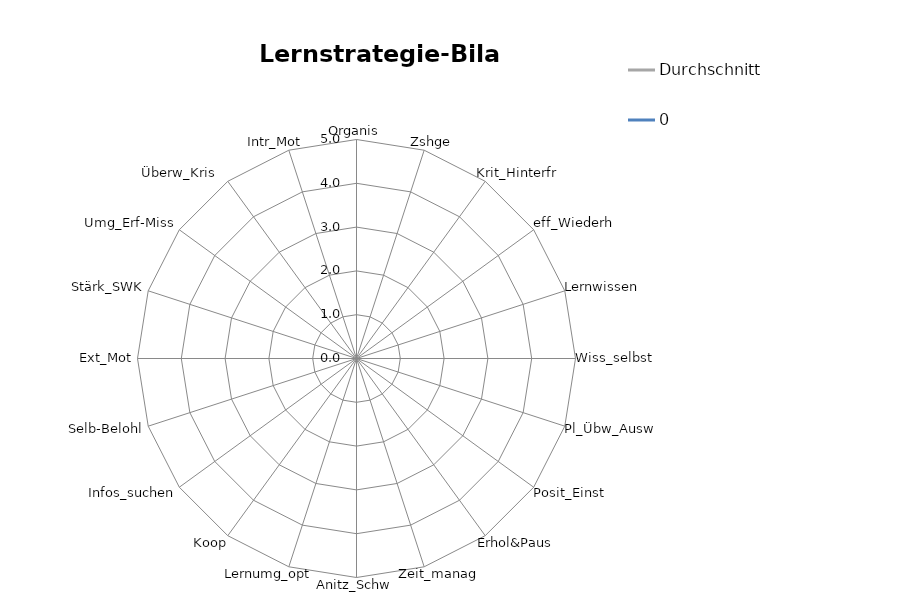
| Category | Durchschnitt | 0 |
|---|---|---|
| Organis | 0 | 0 |
| Zshge | 0 | 0 |
| Krit_Hinterfr | 0 | 0 |
| eff_Wiederh | 0 | 0 |
| Lernwissen | 0 | 0 |
| Wiss_selbst | 0 | 0 |
| Pl_Übw_Ausw | 0 | 0 |
| Posit_Einst | 0 | 0 |
| Erhol&Paus | 0 | 0 |
| Zeit_manag | 0 | 0 |
| Anitz_Schw | 0 | 0 |
| Lernumg_opt | 0 | 0 |
| Koop | 0 | 0 |
| Infos_suchen | 0 | 0 |
| Selb-Belohl | 0 | 0 |
| Ext_Mot | 0 | 0 |
| Stärk_SWK | 0 | 0 |
| Umg_Erf-Miss | 0 | 0 |
| Überw_Kris     | 0 | 0 |
| Intr_Mot | 0 | 0 |